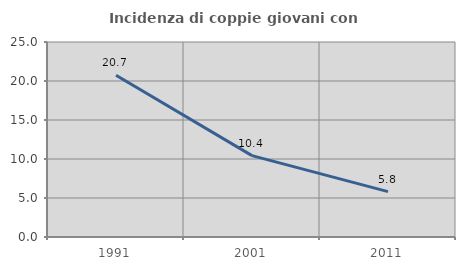
| Category | Incidenza di coppie giovani con figli |
|---|---|
| 1991.0 | 20.743 |
| 2001.0 | 10.429 |
| 2011.0 | 5.821 |